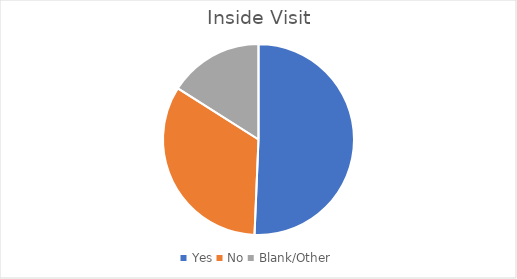
| Category | Series 0 |
|---|---|
| Yes | 38 |
| No | 25 |
| Blank/Other | 12 |